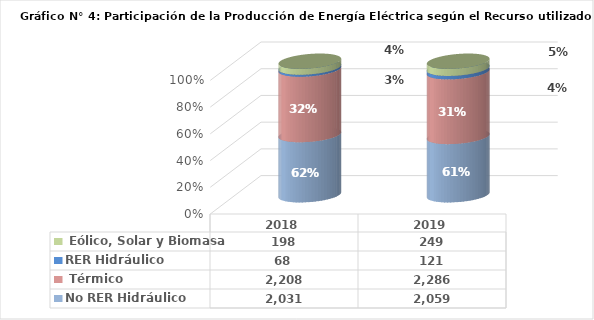
| Category | No RER | RER |
|---|---|---|
| 2018.0 | 2207.513 | 197.829 |
| 2019.0 | 2285.651 | 248.783 |